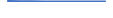
| Category | Series 0 |
|---|---|
| 0 | 206 |
| 1 | 165 |
| 2 | 127 |
| 3 | 125 |
| 4 | 112 |
| 5 | 105 |
| 6 | 116 |
| 7 | 92 |
| 8 | 108 |